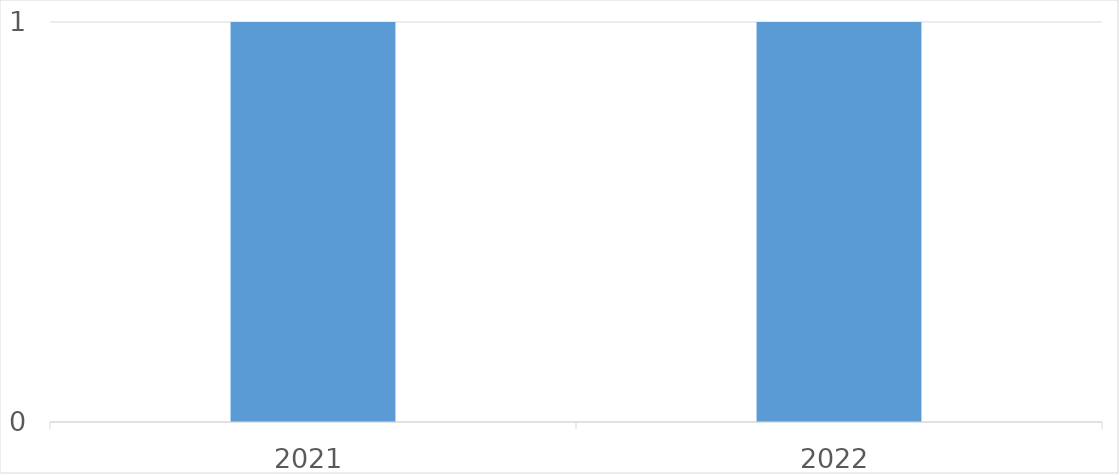
| Category | Series 0 |
|---|---|
| 2021 | 1 |
| 2022 | 1 |